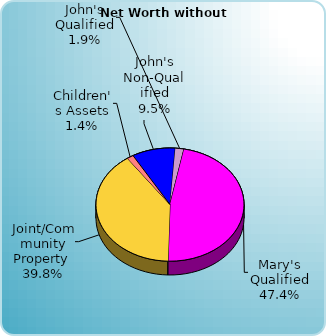
| Category | Series 0 |
|---|---|
| John's Non-Qualified | 125000 |
| John's Qualified | 25000 |
| Mary's Non-Qualified | 0 |
| Mary's Qualified | 625000 |
| Joint/Community Property  | 525000 |
| Children's Assets | 19000 |